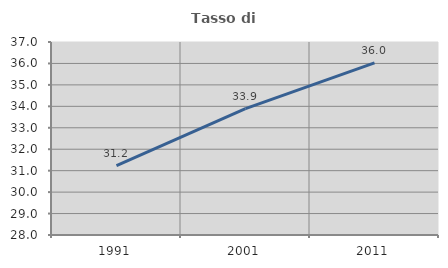
| Category | Tasso di occupazione   |
|---|---|
| 1991.0 | 31.231 |
| 2001.0 | 33.895 |
| 2011.0 | 36.024 |